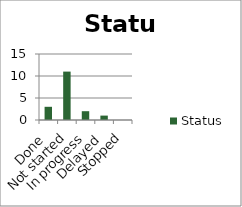
| Category | Status |
|---|---|
| Done | 3 |
| Not started | 11 |
| In progress | 2 |
| Delayed | 1 |
| Stopped | 0 |